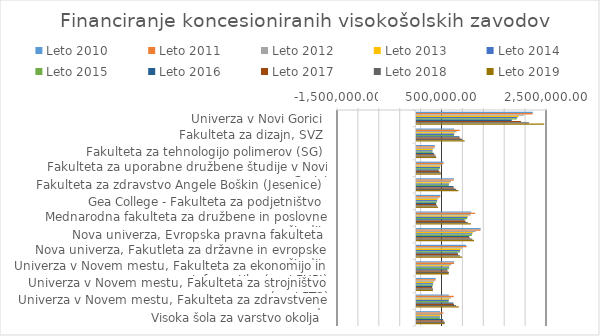
| Category | Leto 2010 | Leto 2011 | Leto 2012 | Leto 2013 | Leto 2014 | Leto 2015 | Leto 2016 | Leto 2017 | Leto 2018 | Leto 2019 |
|---|---|---|---|---|---|---|---|---|---|---|
| Univerza v Novi Gorici | 2227141.25 | 2223820.62 | 2055446.77 | 1961156.98 | 1932928 | 1921737.15 | 1825650.29 | 2003683.55 | 2155021.21 | 2446806.64 |
| Fakulteta za dizajn, SVZ | 724939.36 | 832962.17 | 769895.46 | 734577.94 | 724004.39 | 719812.7 | 822062.78 | 840448.33 | 881431.96 | 924186.67 |
| Fakulteta za tehnologijo polimerov (SG) | 352651.74 | 355600.29 | 328676.45 | 313599.03 | 309085.07 | 307295.59 | 335199.14 | 348932.21 | 372780.07 | 380754.33 |
| Fakulteta za uporabne družbene študije v Novi Gorici | 519209.11 | 518434.98 | 479182.31 | 457200.72 | 450619.75 | 448010.85 | 425610.31 | 441288.51 | 465693.63 | 469396.19 |
| Fakulteta za zdravstvo Angele Boškin (Jesenice) | 718305.62 | 717234.64 | 662930.1 | 632519.42 | 623414.91 | 619805.6 | 707849.58 | 724087.26 | 761513.22 | 803569.74 |
| Gea College - Fakulteta za podjetništvo | 458310.75 | 457627.42 | 422978.72 | 403575.36 | 397766.28 | 395463.38 | 375690.21 | 381193.54 | 397409.68 | 414809.46 |
| Mednarodna fakulteta za družbene in poslovne študije | 1051997.72 | 1125118.04 | 1039931.11 | 992226.21 | 977944.06 | 972282.18 | 923668.07 | 940379.5 | 984386.92 | 1045208.16 |
| Nova univerza, Evropska pravna fakulteta | 1229858.11 | 1228024.41 | 1135046.05 | 1082977.93 | 1067389.49 | 1061209.75 | 1008149.26 | 1022405.44 | 1068376.98 | 1102424.63 |
| Nova univerza, Fakutleta za državne in evropske študije | 949323.96 | 963206.25 | 890278.27 | 849438.42 | 837211.57 | 832364.46 | 790746.24 | 798223.25 | 832364.54 | 875353.09 |
| Univerza v Novem mestu, Fakulteta za ekonomijo in informatiko (prej FUPI) | 723639.82 | 722560.89 | 667853.08 | 637216.57 | 628044.45 | 624408.34 | 593187.92 | 597613.44 | 622612.7 | 619320.38 |
| Univerza v Novem mestu, Fakulteta za strojništvo (prej FTS) | 369886.46 | 369334.97 | 341371.23 | 325711.46 | 321023.15 | 319164.56 | 303206.33 | 305338.38 | 318049.4 | 318601.14 |
| Univerza v Novem mestu, Fakulteta za zdravstvene vede | 620796.49 | 715481.6 | 661309.79 | 630973.44 | 621891.18 | 618290.69 | 706119.47 | 719842.35 | 755889.77 | 812419.85 |
| Visoka šola za varstvo okolja | 451746.61 | 518562.97 | 479300.61 | 457313.59 | 450731 | 448121.46 | 511777.54 | 520431.2 | 543116.75 | 540433.88 |